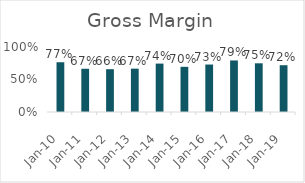
| Category | Gross Margin |
|---|---|
| 2010-03-31 | 0.765 |
| 2011-03-31 | 0.665 |
| 2012-03-31 | 0.659 |
| 2013-03-31 | 0.667 |
| 2014-03-31 | 0.745 |
| 2015-03-31 | 0.695 |
| 2016-03-31 | 0.73 |
| 2017-03-31 | 0.793 |
| 2018-03-31 | 0.749 |
| 2019-03-31 | 0.72 |